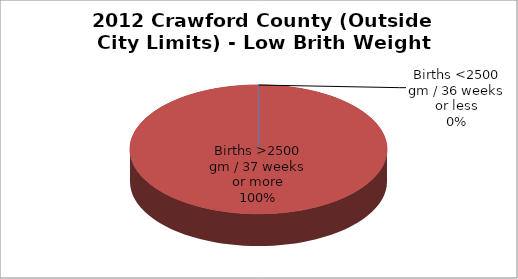
| Category | Series 0 |
|---|---|
| Births <2500 gm / 36 weeks or less | 0 |
| Births >2500 gm / 37 weeks or more | 3 |